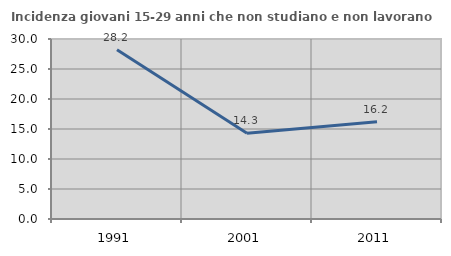
| Category | Incidenza giovani 15-29 anni che non studiano e non lavorano  |
|---|---|
| 1991.0 | 28.205 |
| 2001.0 | 14.286 |
| 2011.0 | 16.19 |